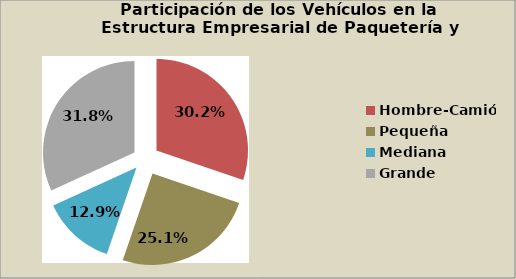
| Category | Series 0 |
|---|---|
| Hombre-Camión | 30.203 |
| Pequeña | 25.051 |
| Mediana | 12.936 |
| Grande | 31.809 |